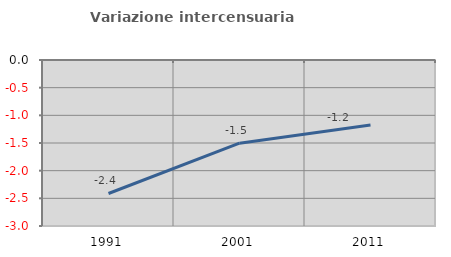
| Category | Variazione intercensuaria annua |
|---|---|
| 1991.0 | -2.412 |
| 2001.0 | -1.504 |
| 2011.0 | -1.174 |